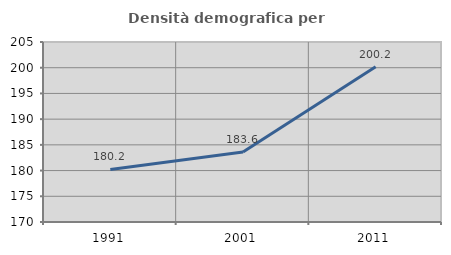
| Category | Densità demografica |
|---|---|
| 1991.0 | 180.214 |
| 2001.0 | 183.618 |
| 2011.0 | 200.173 |